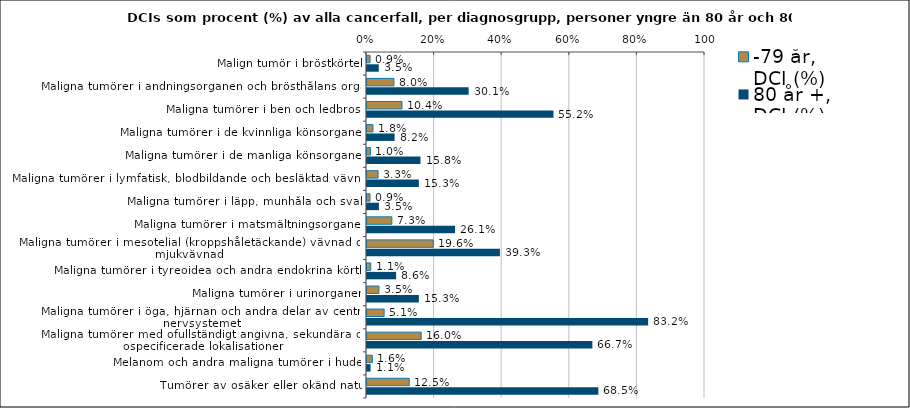
| Category | -79 år, DCI (%) | 80 år +, DCI (%) |
|---|---|---|
| Malign tumör i bröstkörtel | 0.009 | 0.035 |
| Maligna tumörer i andningsorganen och brösthålans organ | 0.08 | 0.301 |
| Maligna tumörer i ben och ledbrosk | 0.104 | 0.552 |
| Maligna tumörer i de kvinnliga könsorganen | 0.018 | 0.082 |
| Maligna tumörer i de manliga könsorganen | 0.01 | 0.158 |
| Maligna tumörer i lymfatisk, blodbildande och besläktad vävnad | 0.033 | 0.153 |
| Maligna tumörer i läpp, munhåla och svalg | 0.009 | 0.035 |
| Maligna tumörer i matsmältningsorganen | 0.073 | 0.261 |
| Maligna tumörer i mesotelial (kroppshåletäckande) vävnad och mjukvävnad | 0.196 | 0.393 |
| Maligna tumörer i tyreoidea och andra endokrina körtlar | 0.011 | 0.086 |
| Maligna tumörer i urinorganen | 0.035 | 0.153 |
| Maligna tumörer i öga, hjärnan och andra delar av centrala nervsystemet | 0.051 | 0.832 |
| Maligna tumörer med ofullständigt angivna, sekundära och ospecificerade lokalisationer | 0.16 | 0.667 |
| Melanom och andra maligna tumörer i huden | 0.016 | 0.011 |
| Tumörer av osäker eller okänd natur | 0.125 | 0.685 |